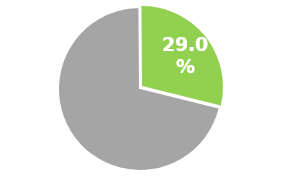
| Category | Series 0 |
|---|---|
| 0 | 0.71 |
| 1 | 0.29 |